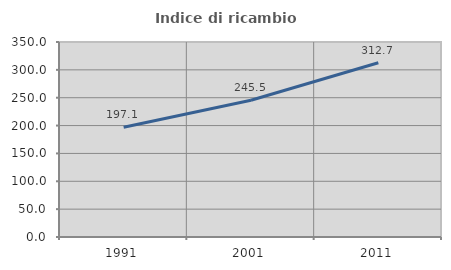
| Category | Indice di ricambio occupazionale  |
|---|---|
| 1991.0 | 197.143 |
| 2001.0 | 245.455 |
| 2011.0 | 312.745 |